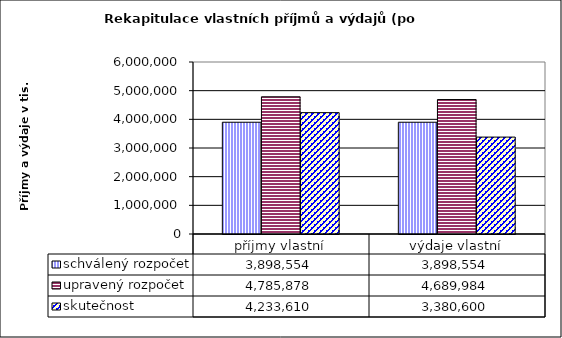
| Category | schválený rozpočet | upravený rozpočet | skutečnost |
|---|---|---|---|
| příjmy vlastní | 3898554 | 4785878 | 4233610 |
| výdaje vlastní | 3898554 | 4689984 | 3380600 |